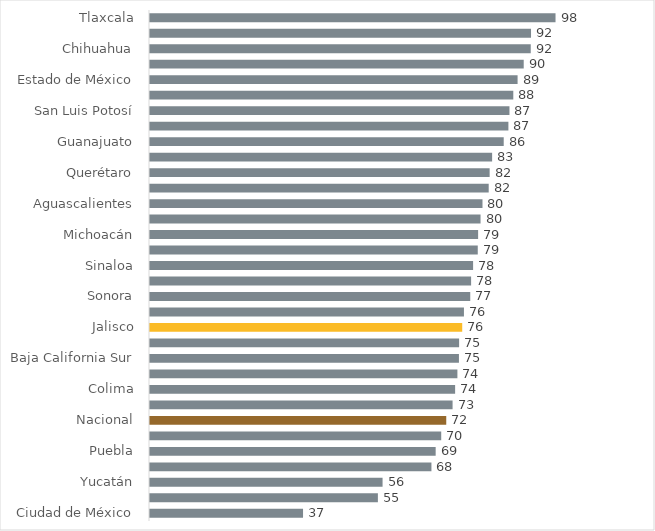
| Category | Series 0 |
|---|---|
| Ciudad de México | 37.026 |
| Veracruz | 55.134 |
| Yucatán | 56.265 |
| Nuevo León | 68.089 |
| Puebla | 69.113 |
| Campeche | 70.456 |
| Nacional | 71.673 |
| Oaxaca | 73.205 |
| Colima | 73.819 |
| Hidalgo | 74.371 |
| Baja California Sur | 74.742 |
| Quintana Roo | 74.785 |
| Jalisco | 75.537 |
| Nayarit | 75.955 |
| Sonora | 77.48 |
| Morelos | 77.687 |
| Sinaloa | 78.169 |
| Baja California | 79.298 |
| Michoacán | 79.385 |
| Tabasco | 79.971 |
| Aguascalientes | 80.442 |
| Coahuila | 81.944 |
| Querétaro | 82.172 |
| Guerrero | 82.772 |
| Guanajuato | 85.577 |
| Chiapas | 86.71 |
| San Luis Potosí | 86.968 |
| Durango | 87.894 |
| Estado de México | 88.932 |
| Tamaulipas | 90.416 |
| Chihuahua | 92.115 |
| Zacatecas | 92.184 |
| Tlaxcala | 98.111 |